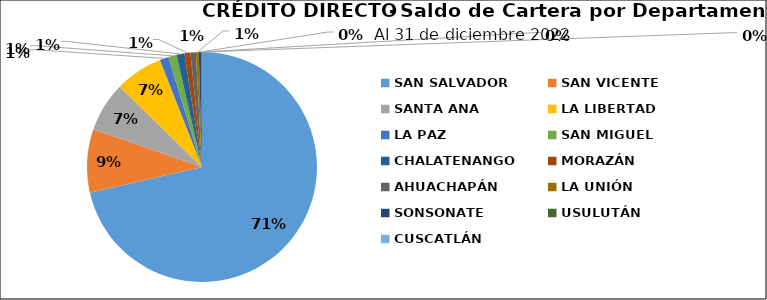
| Category | Saldo | Créditos |
|---|---|---|
| SAN SALVADOR | 130.1 | 48 |
| SAN VICENTE | 16.234 | 2 |
| SANTA ANA | 12.734 | 5 |
| LA LIBERTAD | 12.282 | 13 |
| LA PAZ | 2.253 | 5 |
| SAN MIGUEL | 2.127 | 4 |
| CHALATENANGO | 2.017 | 5 |
| MORAZÁN | 1.529 | 2 |
| AHUACHAPÁN | 1.376 | 1 |
| LA UNIÓN | 0.739 | 3 |
| SONSONATE | 0.636 | 3 |
| USULUTÁN | 0.16 | 1 |
| CUSCATLÁN | 0.023 | 1 |